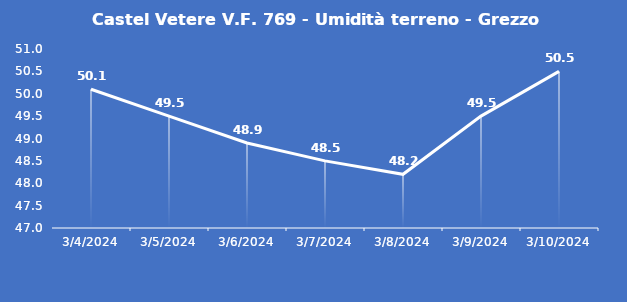
| Category | Castel Vetere V.F. 769 - Umidità terreno - Grezzo (%VWC) |
|---|---|
| 3/4/24 | 50.1 |
| 3/5/24 | 49.5 |
| 3/6/24 | 48.9 |
| 3/7/24 | 48.5 |
| 3/8/24 | 48.2 |
| 3/9/24 | 49.5 |
| 3/10/24 | 50.5 |